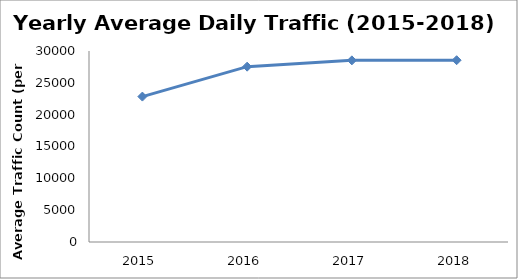
| Category | Series 0 |
|---|---|
| 2015.0 | 22840 |
| 2016.0 | 27540.577 |
| 2017.0 | 28528.877 |
| 2018.0 | 28556.696 |